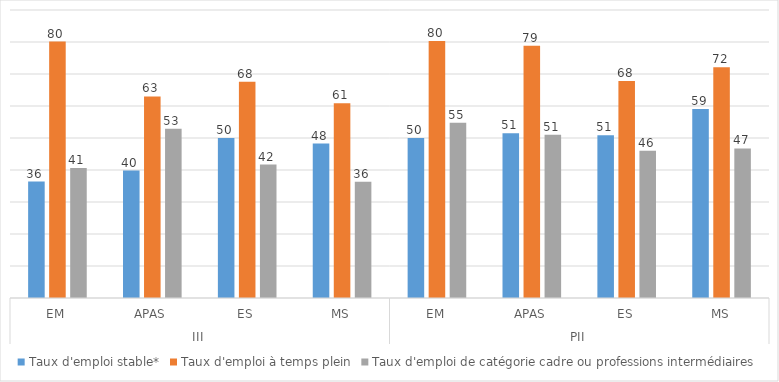
| Category | Taux d'emploi stable* | Taux d'emploi à temps plein | Taux d'emploi de catégorie cadre ou professions intermédiaires |
|---|---|---|---|
| 0 | 36.38 | 80.15 | 40.62 |
| 1 | 39.82 | 63 | 52.9 |
| 2 | 49.98 | 67.6 | 41.71 |
| 3 | 48.27 | 60.87 | 36.29 |
| 4 | 49.99 | 80.3 | 54.75 |
| 5 | 51.47 | 78.83 | 51.01 |
| 6 | 50.86 | 67.78 | 45.99 |
| 7 | 59.04 | 72.11 | 46.74 |